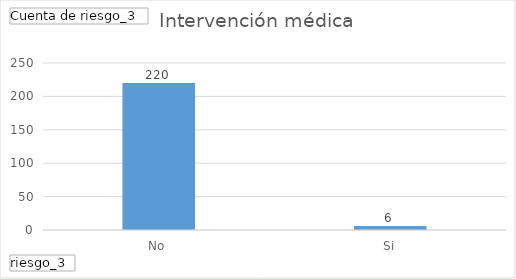
| Category | Total |
|---|---|
| No | 220 |
| Si | 6 |